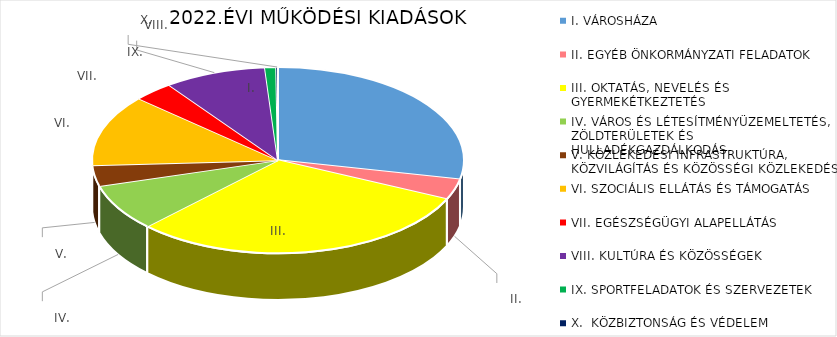
| Category | Series 0 | I. VÁROSHÁZA | I. |
|---|---|---|---|
| I. VÁROSHÁZA | 292313 |  |  |
| II. EGYÉB ÖNKORMÁNYZATI FELADATOK | 36989 |  |  |
| III. OKTATÁS, NEVELÉS ÉS GYERMEKÉTKEZTETÉS | 314814 |  |  |
| IV. VÁROS ÉS LÉTESÍTMÉNYÜZEMELTETÉS, ZÖLDTERÜLETEK ÉS HULLADÉKGAZDÁLKODÁS | 83968 |  |  |
| V. KÖZLEKEDÉSI INFRASTRUKTÚRA, KÖZVILÁGÍTÁS ÉS KÖZÖSSÉGI KÖZLEKEDÉS | 37069 |  |  |
| VI. SZOCIÁLIS ELLÁTÁS ÉS TÁMOGATÁS | 128012 |  |  |
| VII. EGÉSZSÉGÜGYI ALAPELLÁTÁS | 35884 |  |  |
| VIII. KULTÚRA ÉS KÖZÖSSÉGEK | 91620 |  |  |
| IX. SPORTFELADATOK ÉS SZERVEZETEK | 10000 |  |  |
| X.  KÖZBIZTONSÁG ÉS VÉDELEM | 1581 |  |  |